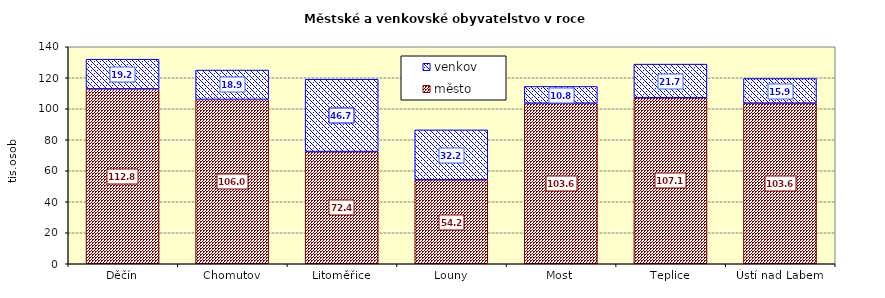
| Category | město | venkov |
|---|---|---|
| Děčín | 112812 | 19163 |
| Chomutov | 106038 | 18925 |
| Litoměřice | 72408 | 46662 |
| Louny | 54158 | 32220 |
| Most | 103609 | 10810 |
| Teplice | 107135 | 21661 |
| Ústí nad Labem | 103641 | 15878 |